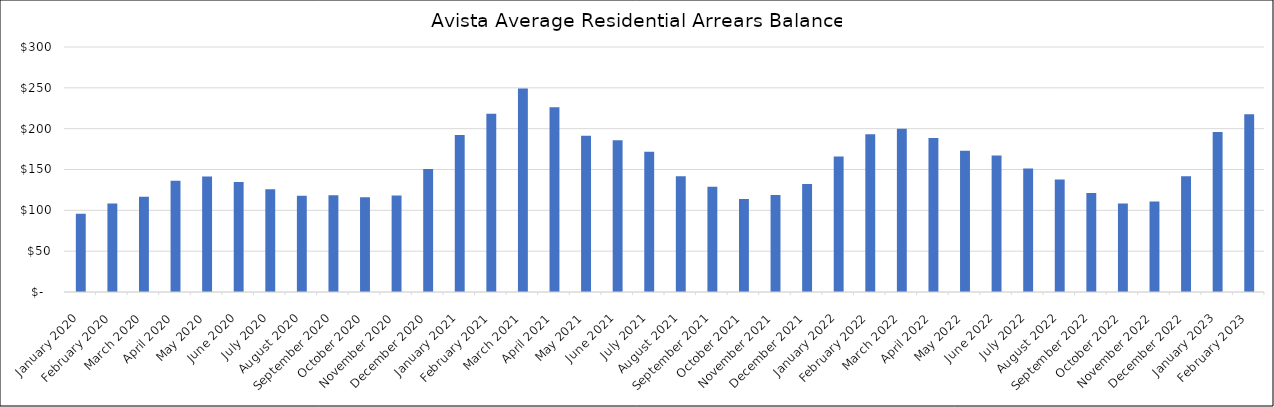
| Category | Average Arrears Balance |
|---|---|
| 2020-01-01 | 95.802 |
| 2020-02-01 | 108.23 |
| 2020-03-01 | 116.572 |
| 2020-04-01 | 136.077 |
| 2020-05-01 | 141.396 |
| 2020-06-01 | 134.562 |
| 2020-07-01 | 125.724 |
| 2020-08-01 | 117.707 |
| 2020-09-01 | 118.488 |
| 2020-10-01 | 115.948 |
| 2020-11-01 | 118.3 |
| 2020-12-01 | 150.476 |
| 2021-01-01 | 192.326 |
| 2021-02-01 | 218.237 |
| 2021-03-01 | 249.075 |
| 2021-04-01 | 226.252 |
| 2021-05-01 | 191.416 |
| 2021-06-01 | 185.86 |
| 2021-07-01 | 171.867 |
| 2021-08-01 | 141.801 |
| 2021-09-01 | 128.976 |
| 2021-10-01 | 113.903 |
| 2021-11-01 | 118.646 |
| 2021-12-01 | 132.162 |
| 2022-01-01 | 165.979 |
| 2022-02-01 | 193.137 |
| 2022-03-01 | 199.975 |
| 2022-04-01 | 188.535 |
| 2022-05-01 | 172.874 |
| 2022-06-01 | 167.275 |
| 2022-07-01 | 151.286 |
| 2022-08-01 | 137.904 |
| 2022-09-01 | 121.322 |
| 2022-10-01 | 108.249 |
| 2022-11-01 | 110.745 |
| 2022-12-01 | 141.651 |
| 2023-01-01 | 196.014 |
| 2023-02-01 | 217.549 |